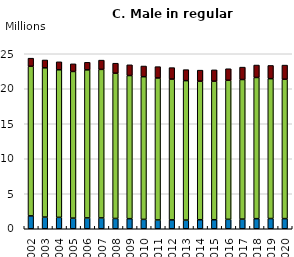
| Category | Under 25 | 25-60  | Over 60 |
|---|---|---|---|
| 2002.0 | 1.84 | 21.37 | 1.16 |
| 2003.0 | 1.67 | 21.32 | 1.12 |
| 2004.0 | 1.63 | 21.08 | 1.14 |
| 2005.0 | 1.52 | 20.95 | 1.09 |
| 2006.0 | 1.55 | 21.15 | 1.08 |
| 2007.0 | 1.55 | 21.22 | 1.32 |
| 2008.0 | 1.47 | 20.75 | 1.43 |
| 2009.0 | 1.44 | 20.45 | 1.53 |
| 2010.0 | 1.34 | 20.38 | 1.53 |
| 2011.0 | 1.26 | 20.28 | 1.62 |
| 2012.0 | 1.27 | 20.11 | 1.64 |
| 2013.0 | 1.24 | 19.92 | 1.57 |
| 2014.0 | 1.29 | 19.79 | 1.58 |
| 2015.0 | 1.29 | 19.79 | 1.62 |
| 2016.0 | 1.35 | 19.86 | 1.65 |
| 2017.0 | 1.38 | 19.94 | 1.77 |
| 2018.0 | 1.44 | 20.17 | 1.78 |
| 2019.0 | 1.46 | 19.98 | 1.89 |
| 2020.0 | 1.45 | 19.91 | 2.02 |